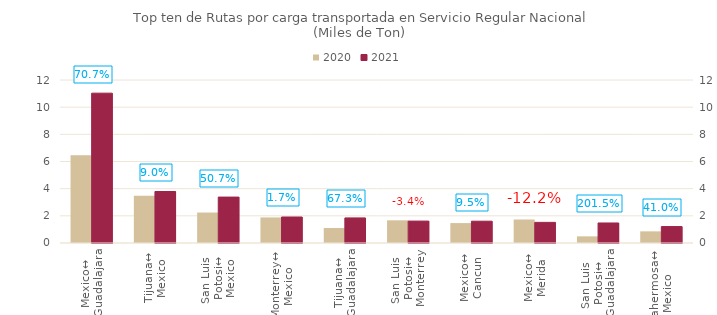
| Category | 2020 | 2021 |
|---|---|---|
| Mexico↔
Guadalajara | 6462.805 | 11030.437 |
| Tijuana↔
Mexico | 3477.5 | 3791.215 |
| San Luis 
Potosi↔
Mexico | 2243.468 | 3380.151 |
| Monterrey↔
Mexico | 1882.681 | 1914.993 |
| Tijuana↔
Guadalajara | 1103.24 | 1845.615 |
| San Luis 
Potosi↔
Monterrey | 1669.772 | 1613.239 |
| Mexico↔
Cancun | 1466.336 | 1605.166 |
| Mexico↔
Merida | 1729.131 | 1518.799 |
| San Luis 
Potosi↔
Guadalajara | 489.119 | 1474.628 |
| Villahermosa↔
Mexico | 858.508 | 1210.724 |